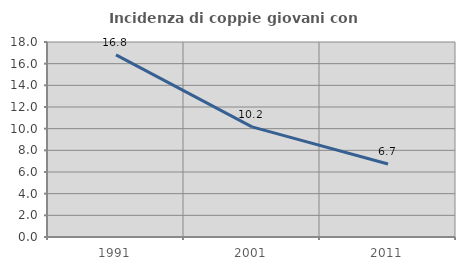
| Category | Incidenza di coppie giovani con figli |
|---|---|
| 1991.0 | 16.818 |
| 2001.0 | 10.169 |
| 2011.0 | 6.738 |